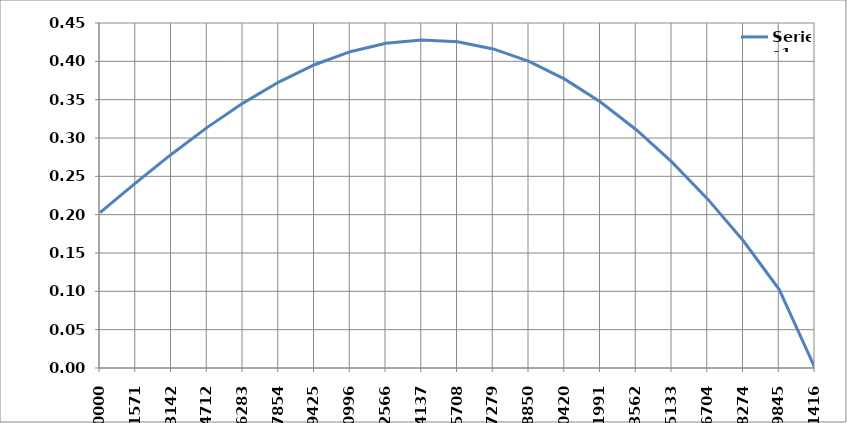
| Category | Series 0 |
|---|---|
| 0.0 | 0.203 |
| 0.15707963267948966 | 0.241 |
| 0.3141592653589793 | 0.279 |
| 0.47123889803846897 | 0.314 |
| 0.6283185307179586 | 0.345 |
| 0.7853981633974483 | 0.373 |
| 0.9424777960769379 | 0.396 |
| 1.0995574287564276 | 0.413 |
| 1.2566370614359172 | 0.423 |
| 1.413716694115407 | 0.428 |
| 1.5707963267948966 | 0.425 |
| 1.727875959474386 | 0.416 |
| 1.8849555921538759 | 0.4 |
| 2.0420352248333655 | 0.377 |
| 2.199114857512855 | 0.347 |
| 2.356194490192345 | 0.311 |
| 2.5132741228718345 | 0.269 |
| 2.670353755551324 | 0.22 |
| 2.827433388230814 | 0.166 |
| 2.9845130209103035 | 0.102 |
| 3.141592653589793 | 0 |